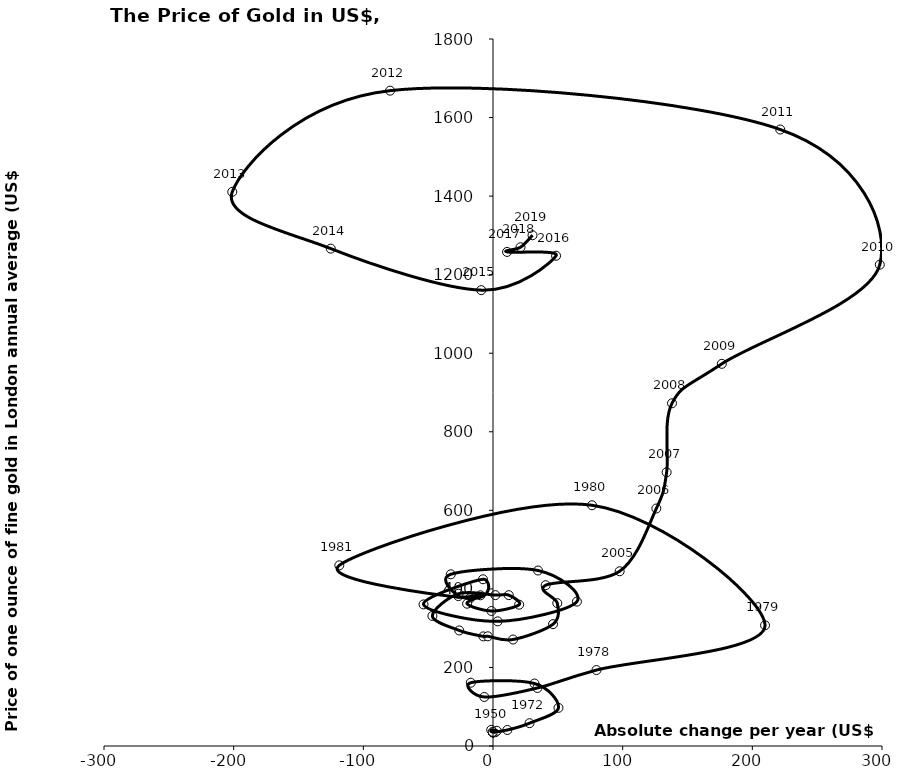
| Category | Series 0 |
|---|---|
| -0.011666666666670267 | 34.729 |
| -0.050416666666663446 | 34.717 |
| 0.08083333333333798 | 34.628 |
| 0.19583333333333286 | 34.879 |
| 0.07208333333333528 | 35.02 |
| -0.016250000000002984 | 35.023 |
| -0.03791666666667126 | 34.988 |
| 0.0520833333333357 | 34.948 |
| 0.07208333333333528 | 35.092 |
| 0.08583333333332988 | 35.092 |
| 0.037916666666664156 | 35.263 |
| -0.07666666666666799 | 35.168 |
| -0.04166666666666785 | 35.11 |
| -0.010833333333330586 | 35.084 |
| 0.021666666666668277 | 35.088 |
| 0.03583333333333627 | 35.128 |
| 0.027916666666666146 | 35.16 |
| 1.765041666666665 | 35.183 |
| 2.9558750000000025 | 38.69 |
| -1.3704166666666673 | 41.095 |
| -0.15366666666666973 | 35.949 |
| 11.077625000000001 | 40.788 |
| 28.168375000000008 | 58.104 |
| 50.49579166666666 | 97.125 |
| 31.983999999999995 | 159.096 |
| -17.133583333333327 | 161.092 |
| -6.690333333333328 | 124.829 |
| 34.26291666666665 | 147.712 |
| 79.79570833333332 | 193.355 |
| 209.79849999999993 | 307.303 |
| 76.35870833333331 | 612.952 |
| -118.51883333333325 | 460.021 |
| -17.75362499999997 | 375.914 |
| -7.727749999999986 | 424.513 |
| -53.582166666666666 | 360.459 |
| 3.603416666666675 | 317.349 |
| 64.7185833333333 | 367.665 |
| 34.728416666666675 | 446.786 |
| -32.56558333333331 | 437.122 |
| -26.712625000000003 | 381.655 |
| -9.697708333333338 | 383.697 |
| -19.986250000000013 | 362.26 |
| -1.2231249999999818 | 343.725 |
| 20.169374999999974 | 359.813 |
| 12.17320833333332 | 384.063 |
| 1.8268750000000296 | 384.16 |
| -26.50800000000001 | 387.717 |
| -46.750708333333364 | 331.144 |
| -26.047583333333336 | 294.216 |
| -7.465791666666661 | 279.049 |
| -3.975416666666632 | 279.284 |
| 15.457708333333358 | 271.098 |
| 46.28908333333328 | 310.199 |
| 49.5670833333333 | 363.676 |
| 40.61458333333337 | 409.334 |
| 97.68620833333335 | 444.905 |
| 125.9735833333333 | 604.706 |
| 133.91629166666672 | 696.852 |
| 138.05966666666677 | 872.539 |
| 176.46062499999994 | 972.972 |
| 298.3018333333332 | 1225.46 |
| 221.51862500000004 | 1569.575 |
| -79.38758333333328 | 1668.497 |
| -201.0807083333334 | 1410.8 |
| -125.10458333333327 | 1266.336 |
| -9.086916666666525 | 1160.591 |
| 48.62879166666664 | 1248.162 |
| 10.84537499999999 | 1257.849 |
| 21.240833333333285 | 1269.853 |
| 30.477666666666437 | 1300.33 |